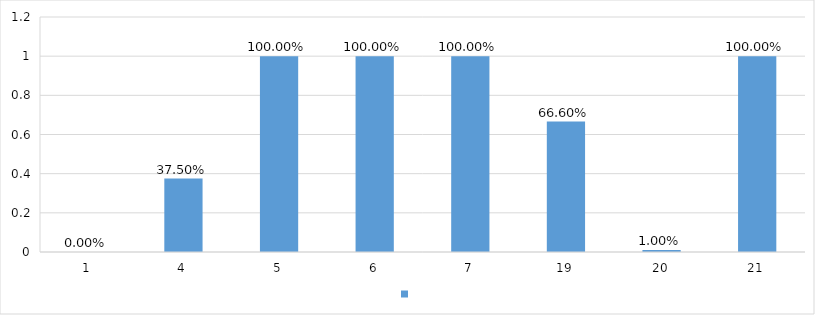
| Category | Series 0 |
|---|---|
| 1 | 0 |
| 4 | 0.375 |
| 5 | 1 |
| 6 | 1 |
| 7 | 1 |
| 19 | 0.666 |
| 20 | 0.01 |
| 21 | 1 |